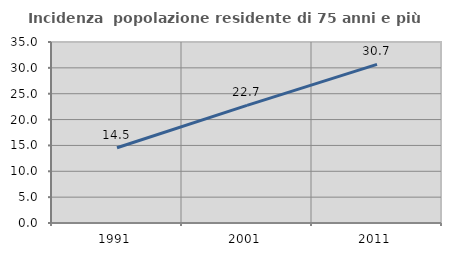
| Category | Incidenza  popolazione residente di 75 anni e più |
|---|---|
| 1991.0 | 14.542 |
| 2001.0 | 22.739 |
| 2011.0 | 30.667 |